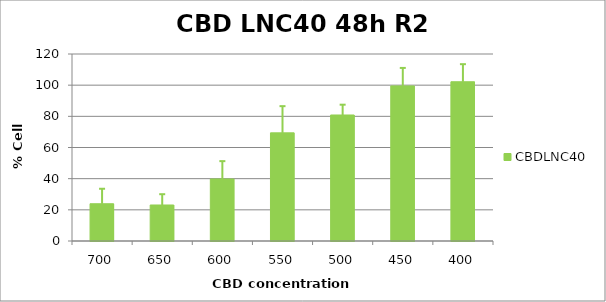
| Category | CBDLNC40 |
|---|---|
| 700.0 | 23.912 |
| 650.0 | 23.107 |
| 600.0 | 39.793 |
| 550.0 | 69.401 |
| 500.0 | 80.858 |
| 450.0 | 99.52 |
| 400.0 | 102.188 |